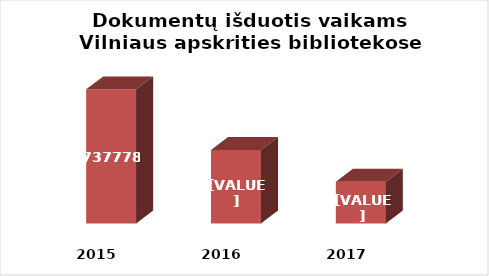
| Category | Series 0 |
|---|---|
| 2015.0 | 737778 |
| 2016.0 | 684498 |
| 2017.0 | 656686 |